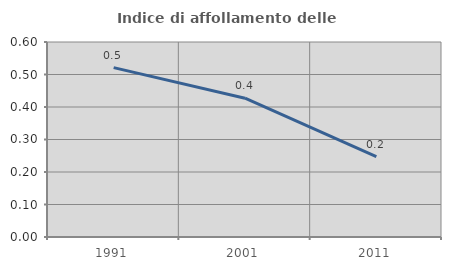
| Category | Indice di affollamento delle abitazioni  |
|---|---|
| 1991.0 | 0.521 |
| 2001.0 | 0.427 |
| 2011.0 | 0.248 |